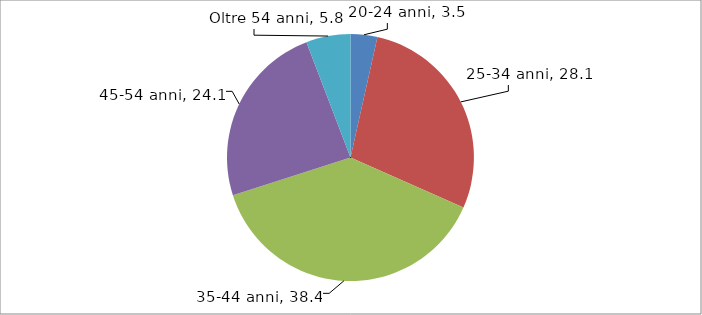
| Category | Series 0 |
|---|---|
| 20-24 anni | 3.5 |
| 25-34 anni | 28.1 |
| 35-44 anni | 38.4 |
| 45-54 anni | 24.1 |
| Oltre 54 anni | 5.8 |